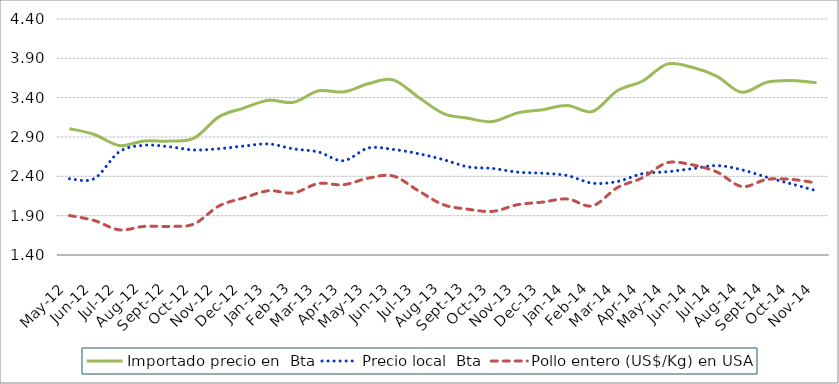
| Category | Importado precio en  Bta  | Precio local  Bta  | Pollo entero (US$/Kg) en USA |
|---|---|---|---|
| 2012-05-01 | 3.007 | 2.369 | 1.902 |
| 2012-06-01 | 2.932 | 2.372 | 1.838 |
| 2012-07-01 | 2.791 | 2.712 | 1.72 |
| 2012-08-01 | 2.849 | 2.795 | 1.764 |
| 2012-09-01 | 2.848 | 2.776 | 1.764 |
| 2012-10-01 | 2.885 | 2.735 | 1.794 |
| 2012-11-01 | 3.156 | 2.751 | 2.023 |
| 2012-12-01 | 3.268 | 2.785 | 2.126 |
| 2013-01-01 | 3.366 | 2.812 | 2.217 |
| 2013-02-01 | 3.341 | 2.749 | 2.189 |
| 2013-03-01 | 3.488 | 2.709 | 2.309 |
| 2013-04-01 | 3.473 | 2.598 | 2.293 |
| 2013-05-01 | 3.577 | 2.76 | 2.377 |
| 2013-06-01 | 3.627 | 2.742 | 2.404 |
| 2013-07-01 | 3.409 | 2.689 | 2.219 |
| 2013-08-01 | 3.202 | 2.614 | 2.041 |
| 2013-09-01 | 3.138 | 2.521 | 1.982 |
| 2013-10-01 | 3.097 | 2.5 | 1.955 |
| 2013-11-01 | 3.206 | 2.453 | 2.04 |
| 2013-12-01 | 3.247 | 2.439 | 2.072 |
| 2014-01-01 | 3.302 | 2.409 | 2.113 |
| 2014-02-01 | 3.224 | 2.313 | 2.025 |
| 2014-03-01 | 3.488 | 2.334 | 2.256 |
| 2014-04-01 | 3.609 | 2.433 | 2.381 |
| 2014-05-01 | 3.826 | 2.459 | 2.573 |
| 2014-06-01 | 3.786 | 2.497 | 2.546 |
| 2014-07-01 | 3.671 | 2.537 | 2.455 |
| 2014-08-01 | 3.468 | 2.483 | 2.271 |
| 2014-09-01 | 3.595 | 2.389 | 2.36 |
| 2014-10-01 | 3.618 | 2.303 | 2.361 |
| 2014-11-01 | 3.589 | 2.216 | 2.315 |